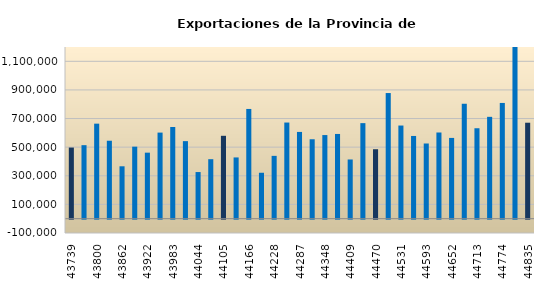
| Category | Exportaciones |
|---|---|
| 2019-10-01 | 497188.203 |
| 2019-11-01 | 513902.151 |
| 2019-12-01 | 664224.395 |
| 2020-01-01 | 544870.53 |
| 2020-02-01 | 366257.69 |
| 2020-03-01 | 503457.96 |
| 2020-04-01 | 461491.76 |
| 2020-05-01 | 601776.55 |
| 2020-06-01 | 641019.7 |
| 2020-07-01 | 542062.84 |
| 2020-08-01 | 326019.87 |
| 2020-09-01 | 415851.9 |
| 2020-10-01 | 579330.62 |
| 2020-11-01 | 428116.983 |
| 2020-12-01 | 766984.753 |
| 2021-01-01 | 321034.51 |
| 2021-02-01 | 439118.25 |
| 2021-03-01 | 672033.91 |
| 2021-04-01 | 606425.01 |
| 2021-05-01 | 555191.59 |
| 2021-06-01 | 584517.86 |
| 2021-07-01 | 592215.46 |
| 2021-08-01 | 413833.07 |
| 2021-09-01 | 667860.28 |
| 2021-10-01 | 485511.53 |
| 2021-11-01 | 878182.96 |
| 2021-12-01 | 651099.404 |
| 2022-01-01 | 578231.872 |
| 2022-02-01 | 525546.083 |
| 2022-03-01 | 602474.187 |
| 2022-04-01 | 564566.111 |
| 2022-05-01 | 803329.469 |
| 2022-06-01 | 632182.316 |
| 2022-07-01 | 711919.091 |
| 2022-08-01 | 808936.658 |
| 2022-09-01 | 1246269.653 |
| 2022-10-01 | 670788.005 |